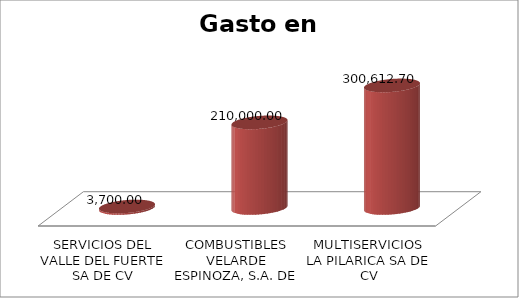
| Category | Suma |
|---|---|
| SERVICIOS DEL VALLE DEL FUERTE SA DE CV | 3700 |
| COMBUSTIBLES VELARDE ESPINOZA, S.A. DE C.V. | 210000 |
| MULTISERVICIOS LA PILARICA SA DE CV | 300612.7 |